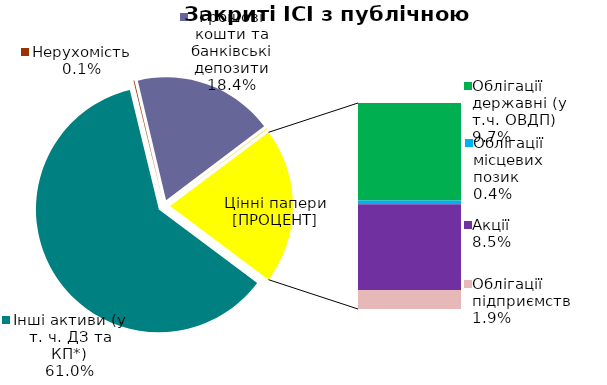
| Category | Series 0 |
|---|---|
| Інші активи (у т. ч. ДЗ та КП*) | 0.61 |
| Нерухомість | 0.001 |
| Грошові кошти та банківські депозити | 0.184 |
| Банківські метали | 0.001 |
| Облігації державні (у т.ч. ОВДП) | 0.097 |
| Облігації місцевих позик | 0.004 |
| Акції | 0.085 |
| Облігації підприємств | 0.019 |
| Векселі | 0 |
| Інші ЦП | 0 |